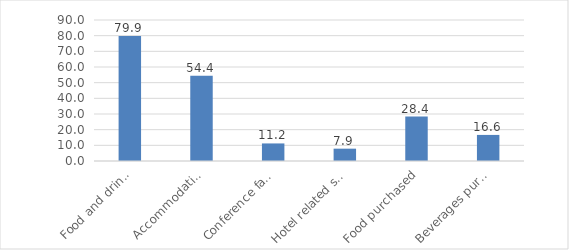
| Category | Frw Billion |
|---|---|
| Food and drinks  | 79.854 |
| Accommodation | 54.377 |
| Conference facilities | 11.211 |
| Hotel related services | 7.868 |
| Food purchased | 28.35 |
| Beverages purchased | 16.648 |